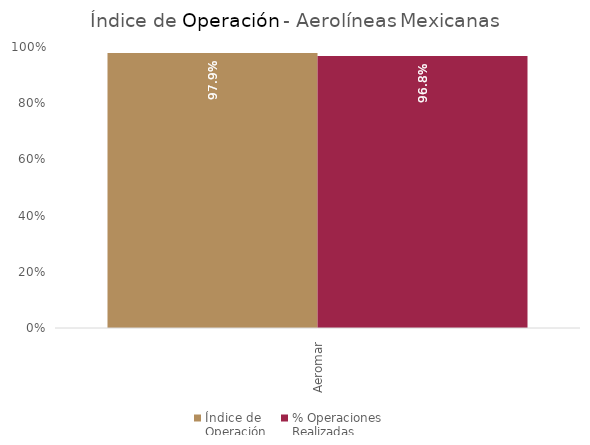
| Category | Índice de 
Operación | % Operaciones
Realizadas |
|---|---|---|
| Aeromar | 0.979 | 0.968 |